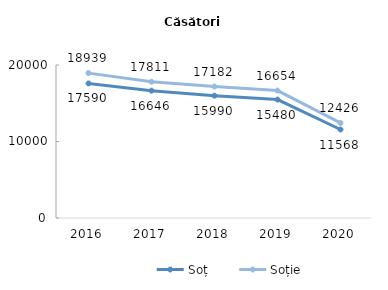
| Category | Soț | Soție |
|---|---|---|
| 2016.0 | 17590 | 18939 |
| 2017.0 | 16646 | 17811 |
| 2018.0 | 15990 | 17182 |
| 2019.0 | 15480 | 16654 |
| 2020.0 | 11568 | 12426 |